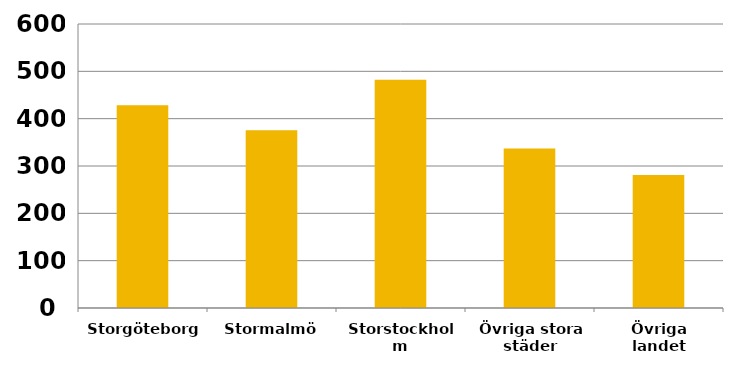
| Category | 2014 |
|---|---|
| Storgöteborg | 428.226 |
| Stormalmö | 375.786 |
| Storstockholm | 482.28 |
| Övriga stora städer | 337.121 |
| Övriga landet | 280.854 |